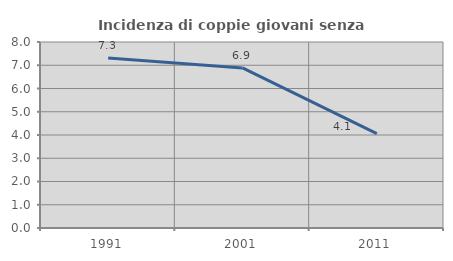
| Category | Incidenza di coppie giovani senza figli |
|---|---|
| 1991.0 | 7.311 |
| 2001.0 | 6.886 |
| 2011.0 | 4.061 |